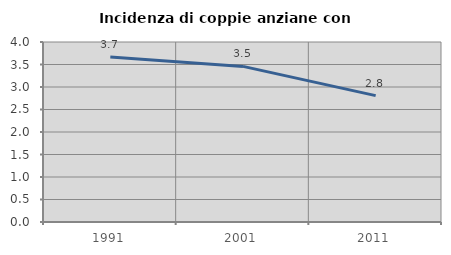
| Category | Incidenza di coppie anziane con figli |
|---|---|
| 1991.0 | 3.667 |
| 2001.0 | 3.458 |
| 2011.0 | 2.809 |